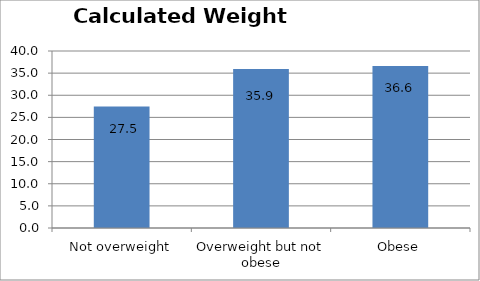
| Category | Series 0 |
|---|---|
| Not overweight | 27.457 |
| Overweight but not obese | 35.911 |
| Obese | 36.631 |